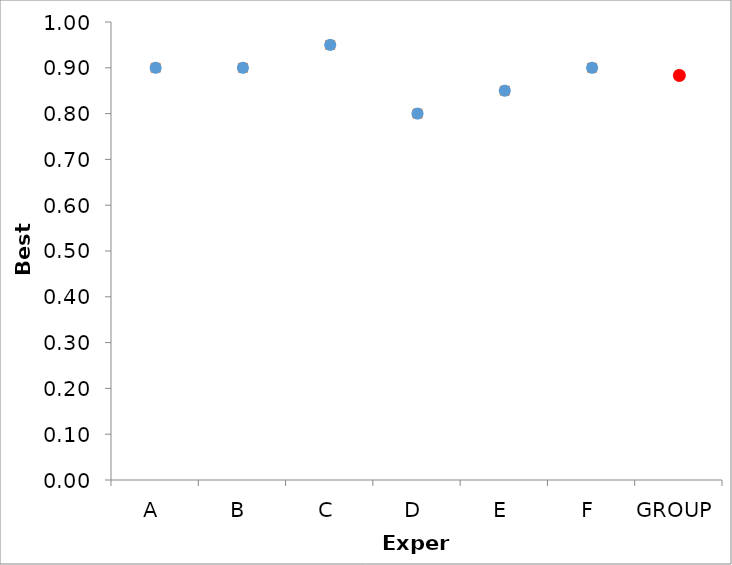
| Category | Series 1 | Series 0 |
|---|---|---|
| A | 0.9 | 0.9 |
| B | 0.9 | 0.9 |
| C | 0.95 | 0.95 |
| D | 0.8 | 0.8 |
| E | 0.85 | 0.85 |
| F | 0.9 | 0.9 |
| GROUP | 0.883 | 0.883 |